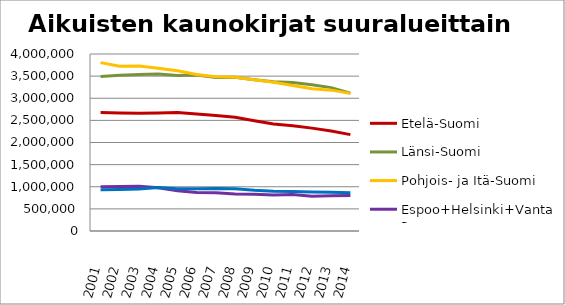
| Category | Etelä-Suomi | Länsi-Suomi | Pohjois- ja Itä-Suomi | Espoo+Helsinki+Vantaa | Muu Uusimaa |
|---|---|---|---|---|---|
| 2001.0 | 2675170 | 3488824 | 3804955 | 1001045 | 934647 |
| 2002.0 | 2666846 | 3517370 | 3725376 | 1004566 | 938319 |
| 2003.0 | 2659866 | 3538627 | 3727461 | 1009928 | 949205 |
| 2004.0 | 2665206 | 3549269 | 3678468 | 979509 | 982001 |
| 2005.0 | 2677014 | 3515511 | 3619518 | 910997 | 955150 |
| 2006.0 | 2643103 | 3522986 | 3537579 | 872760 | 954372 |
| 2007.0 | 2608646 | 3469473 | 3486521 | 863897 | 960613 |
| 2008.0 | 2569986 | 3476709 | 3473178 | 836179 | 957218 |
| 2009.0 | 2490330 | 3420568 | 3416380 | 832969 | 919045 |
| 2010.0 | 2418007 | 3371962 | 3363501 | 811753 | 900438 |
| 2011.0 | 2380493 | 3354310 | 3289402 | 823032 | 893066 |
| 2012.0 | 2324914 | 3304335 | 3217292 | 783537 | 883517 |
| 2013.0 | 2258200 | 3240556 | 3183288 | 797823 | 877189 |
| 2014.0 | 2178150 | 3111705 | 3110454 | 801058 | 862860 |